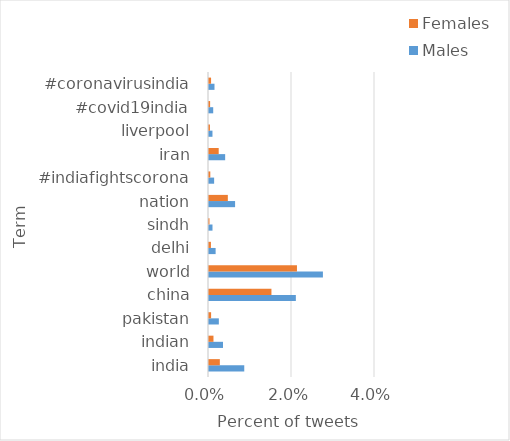
| Category | Males | Females |
|---|---|---|
| india | 0.008 | 0.003 |
| indian | 0.003 | 0.001 |
| pakistan | 0.002 | 0.001 |
| china | 0.021 | 0.015 |
| world | 0.027 | 0.021 |
| delhi | 0.002 | 0 |
| sindh | 0.001 | 0 |
| nation | 0.006 | 0.005 |
| #indiafightscorona | 0.001 | 0 |
| iran | 0.004 | 0.002 |
| liverpool | 0.001 | 0 |
| #covid19india | 0.001 | 0 |
| #coronavirusindia | 0.001 | 0 |